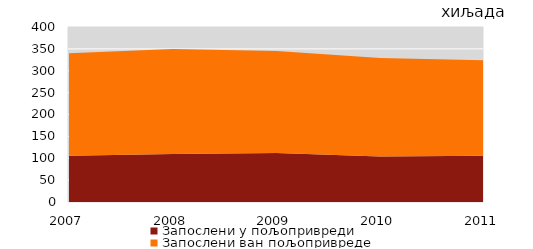
| Category | Запослени у пољопривреди | Запослени ван пољопривреде |
|---|---|---|
| 2007.0 | 106 | 234 |
| 2008.0 | 110 | 240 |
| 2009.0 | 112 | 233 |
| 2010.0 | 104 | 225 |
| 2011.0 | 106 | 218 |